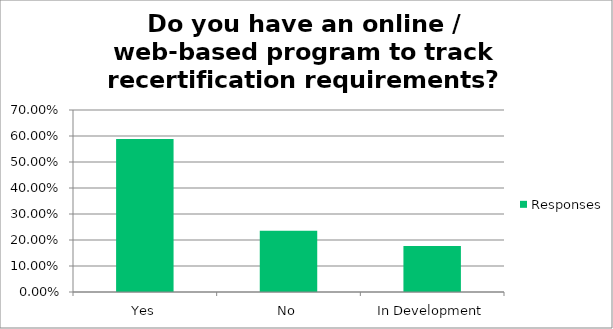
| Category | Responses |
|---|---|
| Yes | 0.588 |
| No | 0.235 |
| In Development | 0.176 |